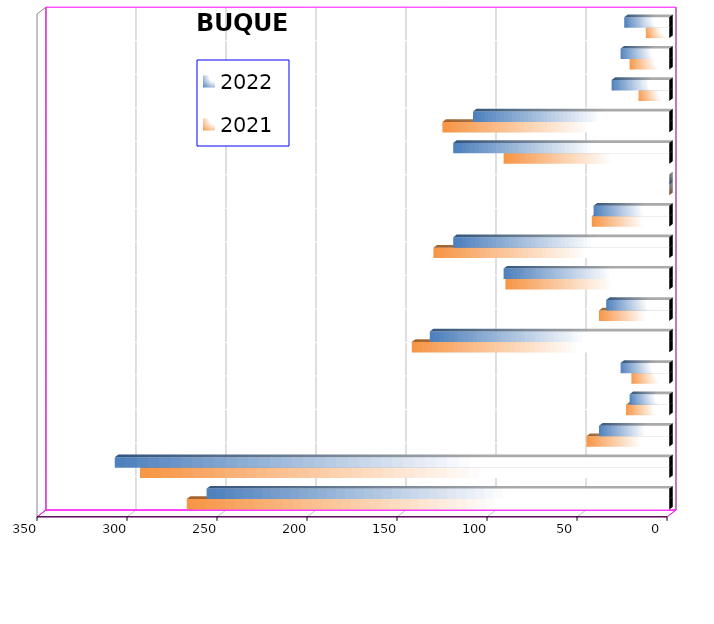
| Category | 2021 | 2022 |
|---|---|---|
| ICAVE | 268 | 257 |
| CICE | 294 | 308 |
| T. C. E. | 46 | 39 |
| CARGILL | 24 | 22 |
| TMV | 21 | 27 |
| SSA | 143 | 133 |
| SEPSA | 39 | 35 |
| VOPAK | 91 | 92 |
| CPV | 131 | 120 |
| EXCELLENCE | 43 | 42 |
| APASCO | 0 | 0 |
| SIPPB | 92 | 120 |
| PEMEX | 126 | 109 |
| PETRA | 17 | 32 |
| OPEVER | 22 | 27 |
| ESJ Renovable III | 13 | 25 |